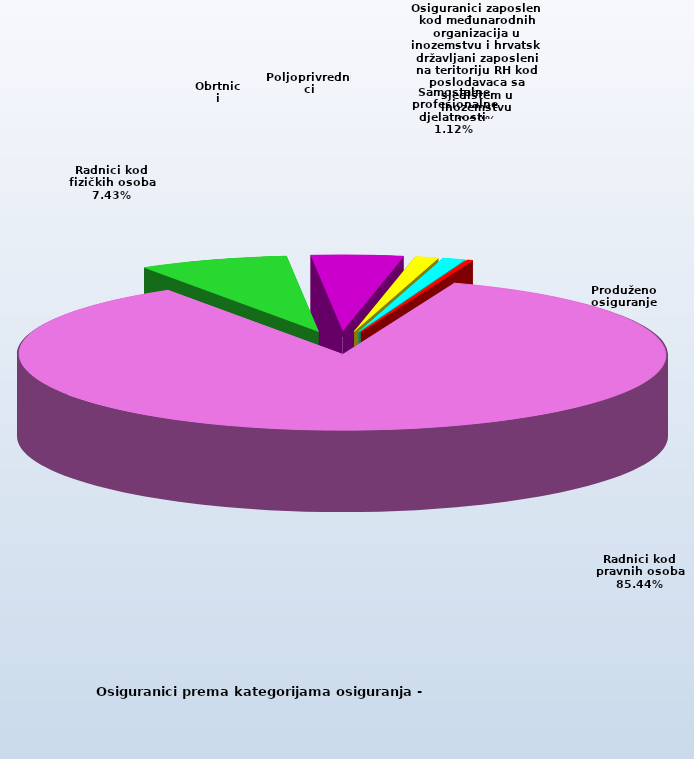
| Category | Series 0 |
|---|---|
| Radnici kod pravnih osoba | 1372697 |
| Radnici kod fizičkih osoba | 119380 |
| Obrtnici | 73347 |
| Poljoprivrednici | 18620 |
| Samostalne profesionalne djelatnosti  | 18037 |
| Osiguranici zaposleni kod međunarodnih organizacija u inozemstvu i hrvatski državljani zaposleni na teritoriju RH kod poslodavaca sa sjedištem u inozemstvu | 61 |
| Produženo osiguranje | 4391 |